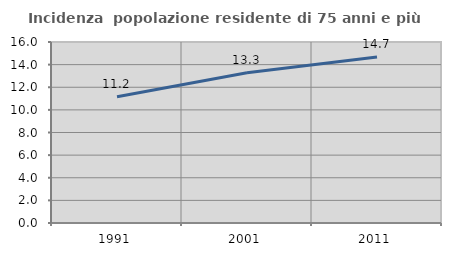
| Category | Incidenza  popolazione residente di 75 anni e più |
|---|---|
| 1991.0 | 11.152 |
| 2001.0 | 13.279 |
| 2011.0 | 14.682 |